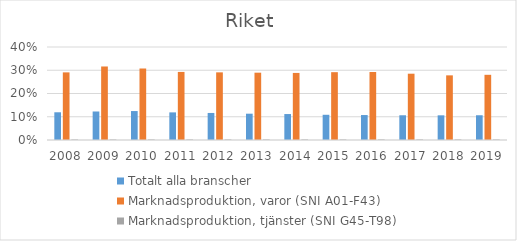
| Category | Totalt alla branscher | Marknadsproduktion, varor (SNI A01-F43) | Marknadsproduktion, tjänster (SNI G45-T98) |
|---|---|---|---|
| 2008 | 0.119 | 0.291 | 0.002 |
| 2009 | 0.123 | 0.316 | 0.002 |
| 2010 | 0.124 | 0.308 | 0.002 |
| 2011 | 0.119 | 0.293 | 0.002 |
| 2012 | 0.116 | 0.291 | 0.002 |
| 2013 | 0.113 | 0.29 | 0.002 |
| 2014 | 0.112 | 0.288 | 0.002 |
| 2015 | 0.108 | 0.292 | 0.002 |
| 2016 | 0.107 | 0.292 | 0.002 |
| 2017 | 0.106 | 0.285 | 0.002 |
| 2018 | 0.106 | 0.278 | 0.002 |
| 2019 | 0.106 | 0.28 | 0.002 |